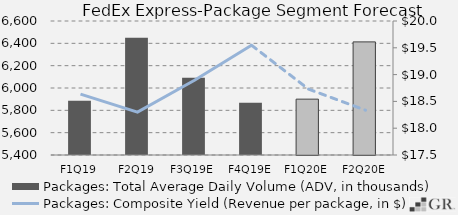
| Category | Packages: Total Average Daily Volume (ADV, in thousands) |
|---|---|
|  F1Q19  | 5886.7 |
|  F2Q19  | 6449.5 |
|  F3Q19E  | 6091.278 |
|  F4Q19E  | 5867.637 |
|  F1Q20E  | 5900.182 |
|  F2Q20E  | 6413.046 |